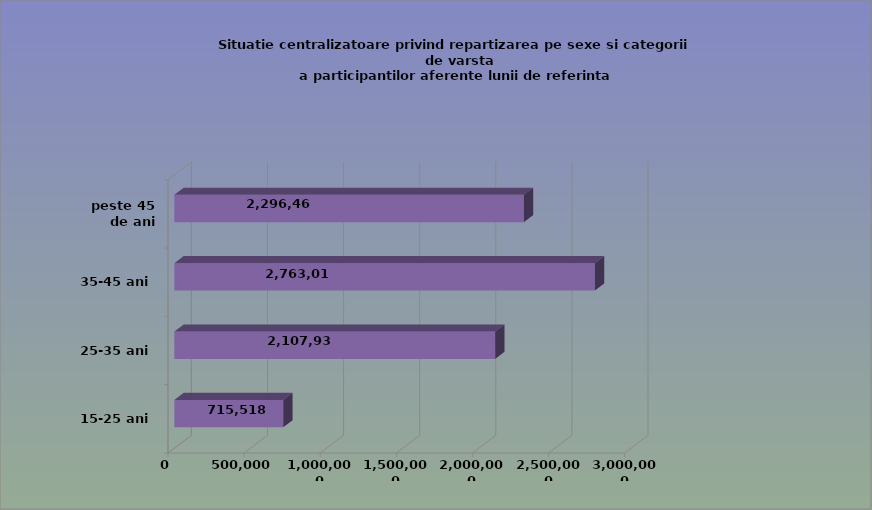
| Category | 15-25 ani 25-35 ani 35-45 ani peste 45 de ani |
|---|---|
| 15-25 ani | 715518 |
| 25-35 ani | 2107937 |
| 35-45 ani | 2763019 |
| peste 45 de ani | 2296469 |